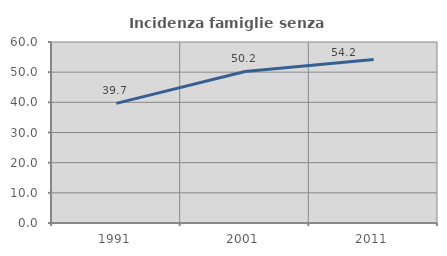
| Category | Incidenza famiglie senza nuclei |
|---|---|
| 1991.0 | 39.662 |
| 2001.0 | 50.244 |
| 2011.0 | 54.167 |